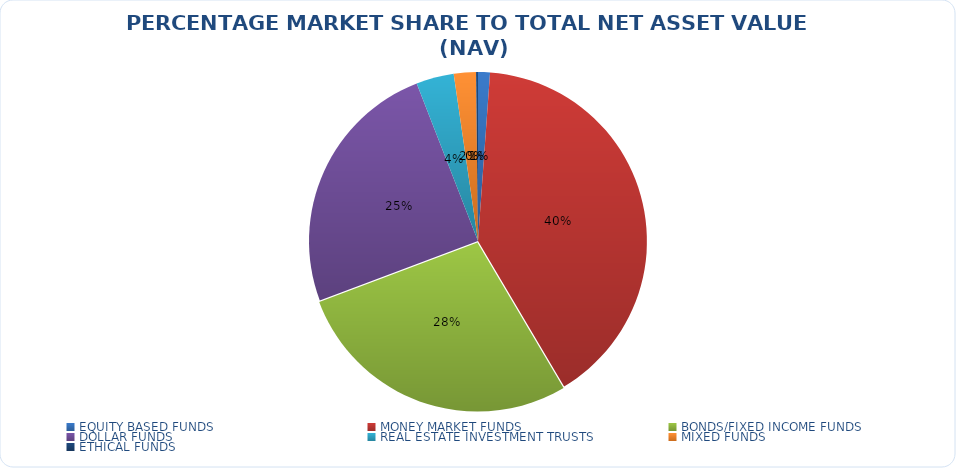
| Category | NET ASSET VALUE |
|---|---|
| EQUITY BASED FUNDS | 15689311730.52 |
| MONEY MARKET FUNDS | 555843226647.569 |
| BONDS/FIXED INCOME FUNDS | 382920424394.07 |
| DOLLAR FUNDS | 341788053113.997 |
| REAL ESTATE INVESTMENT TRUSTS | 49676814020.39 |
| MIXED FUNDS | 29158649237.096 |
| ETHICAL FUNDS | 2529688704.6 |